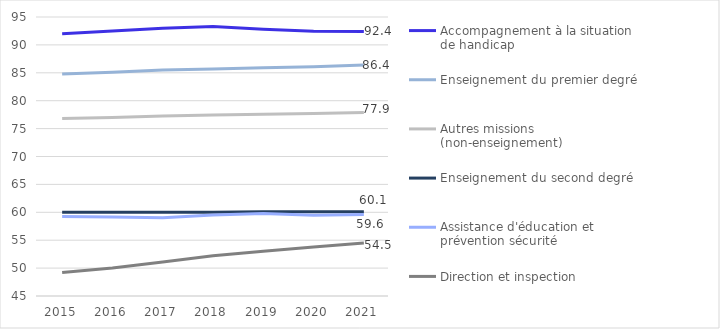
| Category | Accompagnement à la situation de handicap | Enseignement du premier degré | Autres missions (non-enseignement) | Enseignement du second degré | Assistance d'éducation et prévention sécurité | Direction et inspection |
|---|---|---|---|---|---|---|
| 2015.0 | 91.98 | 84.8 | 76.83 | 60 | 59.26 | 49.2 |
| 2016.0 | 92.51 | 85.1 | 76.97 | 60 | 59.18 | 50 |
| 2017.0 | 92.97 | 85.5 | 77.24 | 60 | 59.04 | 51.1 |
| 2018.0 | 93.28 | 85.7 | 77.44 | 60 | 59.51 | 52.2 |
| 2019.0 | 92.82 | 85.9 | 77.56 | 60.1 | 59.8 | 53 |
| 2020.0 | 92.44 | 86.1 | 77.7 | 60.1 | 59.46 | 53.8 |
| 2021.0 | 92.42 | 86.4 | 77.9 | 60.1 | 59.61 | 54.5 |